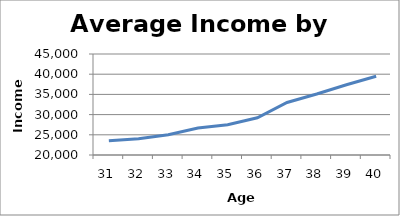
| Category | Income |
|---|---|
| 31.0 | 23500 |
| 32.0 | 24000 |
| 33.0 | 25000 |
| 34.0 | 26700 |
| 35.0 | 27500 |
| 36.0 | 29200 |
| 37.0 | 33000 |
| 38.0 | 35100 |
| 39.0 | 37400 |
| 40.0 | 39500 |